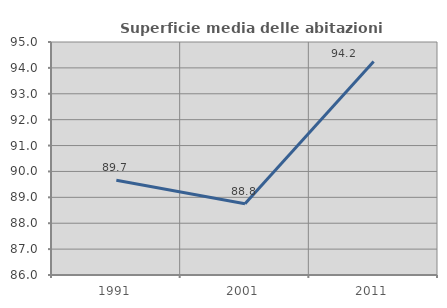
| Category | Superficie media delle abitazioni occupate |
|---|---|
| 1991.0 | 89.663 |
| 2001.0 | 88.756 |
| 2011.0 | 94.248 |